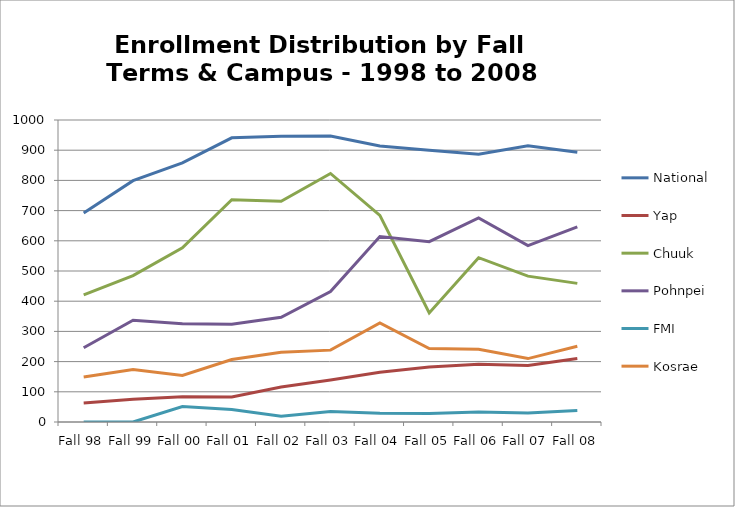
| Category | National | Yap | Chuuk | Pohnpei | FMI | Kosrae |
|---|---|---|---|---|---|---|
| Fall 98 | 692 | 63 | 421 | 246 | 0 | 149 |
| Fall 99 | 799 | 75 | 485 | 337 | 0 | 174 |
| Fall 00 | 858 | 84 | 577 | 325 | 51 | 154 |
| Fall 01 | 941 | 83 | 736 | 324 | 41 | 207 |
| Fall 02 | 946 | 116 | 731 | 347 | 19 | 231 |
| Fall 03 | 947 | 139 | 823 | 432 | 35 | 238 |
| Fall 04 | 914 | 165 | 684 | 614 | 29 | 328 |
| Fall 05 | 900 | 182 | 361 | 597 | 28 | 243 |
| Fall 06 | 887 | 191 | 544 | 676 | 33 | 241 |
| Fall 07 | 915 | 187 | 483 | 584 | 30 | 210 |
| Fall 08 | 893 | 210 | 459 | 646 | 38 | 251 |